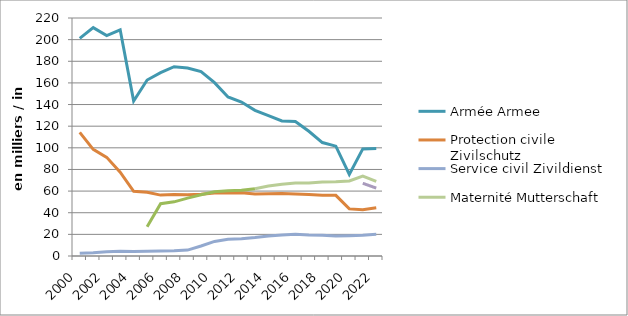
| Category | Armée | Protection civile | Service civil | Maternité | Paternité |
|---|---|---|---|---|---|
| 2000.0 | 201.21 | 114.31 | 2.56 | 0 | 0 |
| 2001.0 | 211.1 | 98.56 | 3.02 | 0 | 0 |
| 2002.0 | 203.68 | 91.18 | 3.91 | 0 | 0 |
| 2003.0 | 209.13 | 77.51 | 4.49 | 0 | 0 |
| 2004.0 | 143.19 | 59.77 | 4.23 | 0 | 0 |
| 2005.0 | 162.64 | 58.97 | 4.37 | 27.14 | 0 |
| 2006.0 | 169.45 | 56.28 | 4.62 | 48.32 | 0 |
| 2007.0 | 174.98 | 56.79 | 4.82 | 50.06 | 0 |
| 2008.0 | 173.81 | 56.72 | 5.45 | 53.54 | 0 |
| 2009.0 | 170.46 | 57.11 | 9.25 | 56.62 | 0 |
| 2010.0 | 160.28 | 58.29 | 13.46 | 59.38 | 0 |
| 2011.0 | 147.01 | 58.16 | 15.4 | 60.21 | 0 |
| 2012.0 | 142.3 | 58.4 | 16.04 | 60.82 | 0 |
| 2013.0 | 134.68 | 57.4 | 17.04 | 62.13 | 0 |
| 2014.0 | 129.77 | 57.52 | 18.41 | 64.64 | 0 |
| 2015.0 | 124.85 | 57.85 | 19.41 | 66.32 | 0 |
| 2016.0 | 124.38 | 57.27 | 20.14 | 67.46 | 0 |
| 2017.0 | 115.32 | 56.81 | 19.43 | 67.55 | 0 |
| 2018.0 | 104.89 | 56.27 | 19.2 | 68.5 | 0 |
| 2019.0 | 101.52 | 56.07 | 18.51 | 68.55 | 0 |
| 2020.0 | 75.47 | 43.53 | 18.77 | 69.4 | 0 |
| 2021.0 | 99.02 | 42.67 | 19.14 | 73.81 | 67.22 |
| 2022.0 | 99.37 | 44.63 | 20 | 69 | 62.77 |